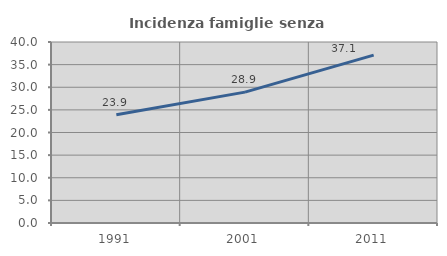
| Category | Incidenza famiglie senza nuclei |
|---|---|
| 1991.0 | 23.912 |
| 2001.0 | 28.919 |
| 2011.0 | 37.091 |